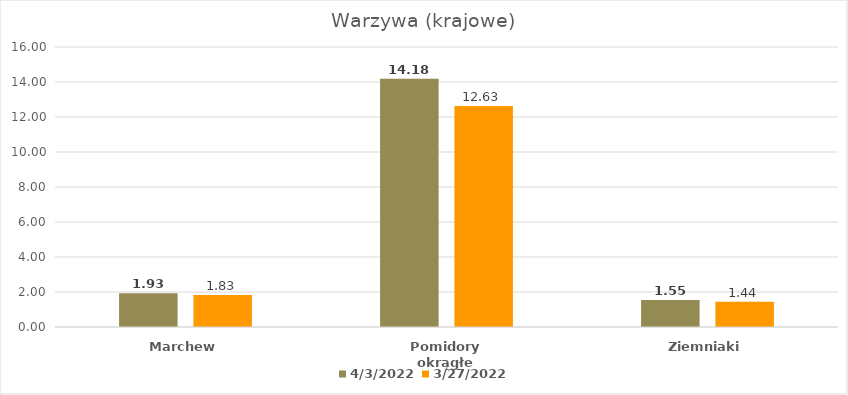
| Category | 2022-04-03 | 2022-03-27 |
|---|---|---|
| Marchew | 1.93 | 1.83 |
| Pomidory okrągłe | 14.18 | 12.63 |
| Ziemniaki | 1.55 | 1.44 |